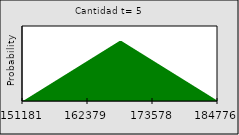
| Category | Series 0 |
|---|---|
| 151180.714681322 | 0 |
| nan | 0 |
| nan | 0.001 |
| nan | 0.001 |
| nan | 0.002 |
| nan | 0.002 |
| nan | 0.002 |
| nan | 0.003 |
| nan | 0.003 |
| nan | 0.004 |
| nan | 0.004 |
| nan | 0.004 |
| nan | 0.005 |
| nan | 0.005 |
| nan | 0.006 |
| nan | 0.006 |
| nan | 0.007 |
| nan | 0.007 |
| nan | 0.007 |
| nan | 0.008 |
| nan | 0.008 |
| nan | 0.009 |
| nan | 0.009 |
| nan | 0.009 |
| nan | 0.01 |
| nan | 0.01 |
| nan | 0.011 |
| nan | 0.011 |
| nan | 0.011 |
| nan | 0.012 |
| nan | 0.012 |
| nan | 0.013 |
| nan | 0.013 |
| 162379.286139198 | 0.013 |
| nan | 0.014 |
| nan | 0.014 |
| nan | 0.015 |
| nan | 0.015 |
| nan | 0.016 |
| nan | 0.016 |
| nan | 0.016 |
| nan | 0.017 |
| nan | 0.017 |
| nan | 0.018 |
| nan | 0.018 |
| nan | 0.018 |
| nan | 0.019 |
| nan | 0.019 |
| nan | 0.02 |
| nan | 0.02 |
| nan | 0.02 |
| nan | 0.02 |
| nan | 0.019 |
| nan | 0.019 |
| nan | 0.018 |
| nan | 0.018 |
| nan | 0.018 |
| nan | 0.017 |
| nan | 0.017 |
| nan | 0.016 |
| nan | 0.016 |
| nan | 0.016 |
| nan | 0.015 |
| nan | 0.015 |
| nan | 0.014 |
| nan | 0.014 |
| 173577.85759707398 | 0.013 |
| nan | 0.013 |
| nan | 0.013 |
| nan | 0.012 |
| nan | 0.012 |
| nan | 0.011 |
| nan | 0.011 |
| nan | 0.011 |
| nan | 0.01 |
| nan | 0.01 |
| nan | 0.009 |
| nan | 0.009 |
| nan | 0.009 |
| nan | 0.008 |
| nan | 0.008 |
| nan | 0.007 |
| nan | 0.007 |
| nan | 0.007 |
| nan | 0.006 |
| nan | 0.006 |
| nan | 0.005 |
| nan | 0.005 |
| nan | 0.004 |
| nan | 0.004 |
| nan | 0.004 |
| nan | 0.003 |
| nan | 0.003 |
| nan | 0.002 |
| nan | 0.002 |
| nan | 0.002 |
| nan | 0.001 |
| nan | 0.001 |
| nan | 0 |
| 184776.42905495 | 0 |